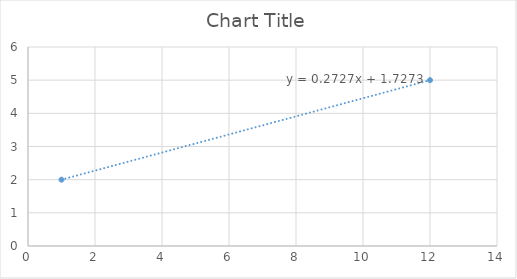
| Category | Series 0 |
|---|---|
| 1.0 | 2 |
| 12.0 | 5 |